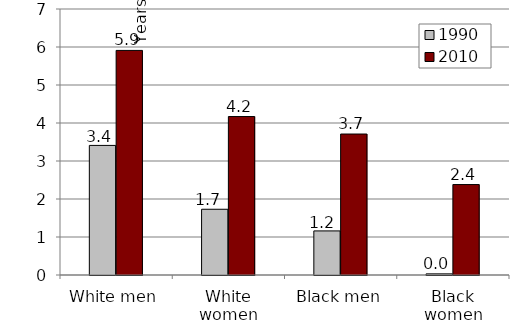
| Category | 1990 | 2010 |
|---|---|---|
| White men | 3.41 | 5.91 |
| White women | 1.73 | 4.17 |
| Black men | 1.16 | 3.71 |
| Black women | 0.03 | 2.38 |